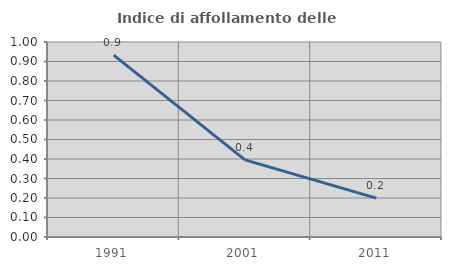
| Category | Indice di affollamento delle abitazioni  |
|---|---|
| 1991.0 | 0.932 |
| 2001.0 | 0.395 |
| 2011.0 | 0.2 |